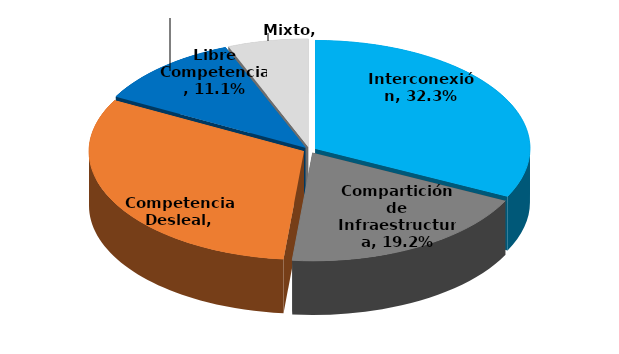
| Category | % |
|---|---|
| Interconexión | 0.323 |
| Compartición de Infraestructura | 0.192 |
| Competencia Desleal | 0.313 |
| Libre Competencia | 0.111 |
| Mixto | 0.061 |